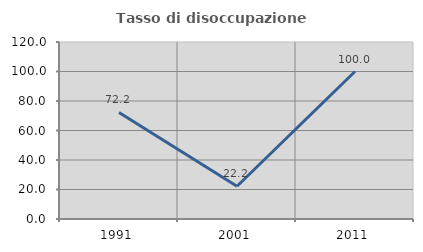
| Category | Tasso di disoccupazione giovanile  |
|---|---|
| 1991.0 | 72.222 |
| 2001.0 | 22.222 |
| 2011.0 | 100 |